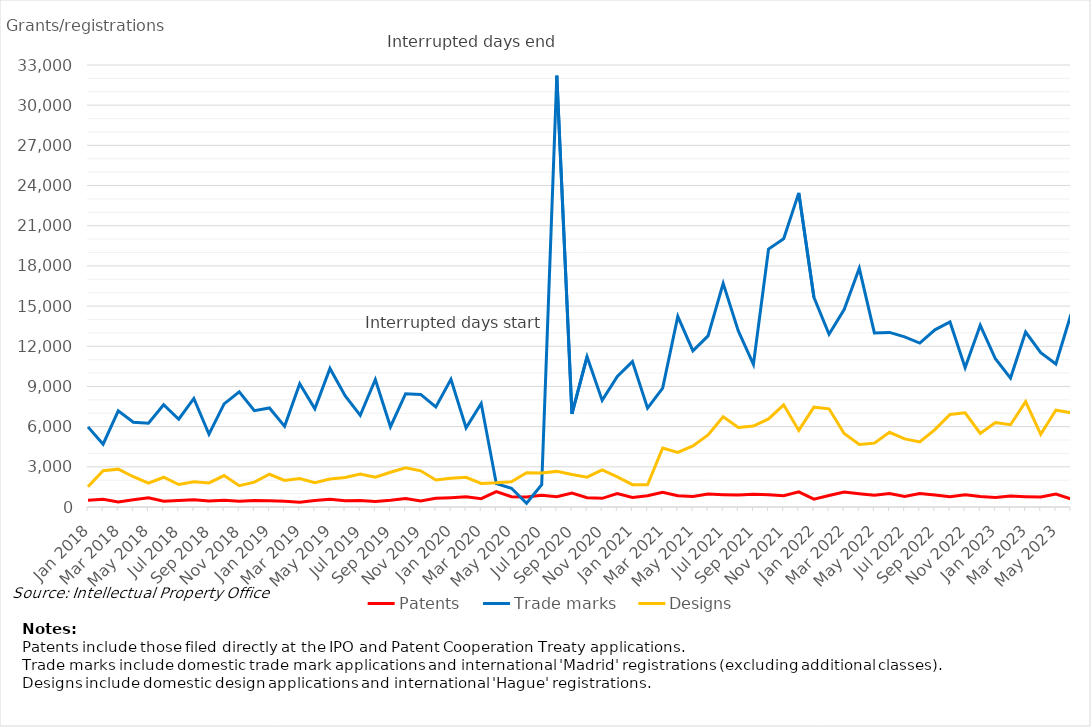
| Category | Patents | Trade marks | Designs |
|---|---|---|---|
| Jan 2018 | 495 | 5980 | 1512 |
| Feb 2018 | 574 | 4687 | 2704 |
| Mar 2018 | 370 | 7179 | 2825 |
| Apr 2018 | 543 | 6334 | 2259 |
| May 2018 | 690 | 6253 | 1789 |
| Jun 2018 | 424 | 7637 | 2222 |
| Jul 2018 | 486 | 6552 | 1678 |
| Aug 2018 | 536 | 8104 | 1878 |
| Sep 2018 | 450 | 5431 | 1795 |
| Oct 2018 | 498 | 7701 | 2348 |
| Nov 2018 | 432 | 8603 | 1592 |
| Dec 2018 | 484 | 7194 | 1859 |
| Jan 2019 | 474 | 7396 | 2444 |
| Feb 2019 | 426 | 6023 | 1987 |
| Mar 2019 | 363 | 9208 | 2125 |
| Apr 2019 | 488 | 7339 | 1810 |
| May 2019 | 573 | 10347 | 2096 |
| Jun 2019 | 471 | 8305 | 2202 |
| Jul 2019 | 489 | 6840 | 2464 |
| Aug 2019 | 420 | 9519 | 2218 |
| Sep 2019 | 500 | 5992 | 2596 |
| Oct 2019 | 634 | 8460 | 2926 |
| Nov 2019 | 455 | 8404 | 2700 |
| Dec 2019 | 654 | 7467 | 2021 |
| Jan 2020 | 696 | 9527 | 2145 |
| Feb 2020 | 756 | 5908 | 2219 |
| Mar 2020 | 622 | 7723 | 1757 |
| Apr 2020 | 1143 | 1743 | 1803 |
| May 2020 | 768 | 1399 | 1888 |
| Jun 2020 | 740 | 282 | 2564 |
| Jul 2020 | 878 | 1660 | 2539 |
| Aug 2020 | 771 | 32206 | 2659 |
| Sep 2020 | 1042 | 6950 | 2425 |
| Oct 2020 | 697 | 11226 | 2223 |
| Nov 2020 | 649 | 7958 | 2763 |
| Dec 2020 | 1010 | 9753 | 2252 |
| Jan 2021 | 708 | 10856 | 1665 |
| Feb 2021 | 838 | 7381 | 1660 |
| Mar 2021 | 1107 | 8878 | 4408 |
| Apr 2021 | 838 | 14235 | 4074 |
| May 2021 | 788 | 11654 | 4562 |
| Jun 2021 | 972 | 12773 | 5385 |
| Jul 2021 | 918 | 16698 | 6731 |
| Aug 2021 | 887 | 13150 | 5944 |
| Sep 2021 | 947 | 10649 | 6041 |
| Oct 2021 | 920 | 19255 | 6577 |
| Nov 2021 | 841 | 20030 | 7629 |
| Dec 2021 | 1131 | 23452 | 5719 |
| Jan 2022 | 585 | 15661 | 7455 |
| Feb 2022 | 860 | 12899 | 7329 |
| Mar 2022 | 1111 | 14745 | 5482 |
| Apr 2022 | 990 | 17821 | 4662 |
| May 2022 | 883 | 12995 | 4767 |
| Jun 2022 | 1010 | 13035 | 5577 |
| Jul 2022 | 788 | 12701 | 5082 |
| Aug 2022 | 1007 | 12237 | 4856 |
| Sep 2022 | 889 | 13229 | 5776 |
| Oct 2022 | 758 | 13818 | 6904 |
| Nov 2022 | 920 | 10407 | 7027 |
| Dec 2022 | 777 | 13566 | 5498 |
| Jan 2023 | 708 | 11068 | 6304 |
| Feb 2023 | 817 | 9626 | 6141 |
| Mar 2023 | 770 | 13064 | 7872 |
| Apr 2023 | 747 | 11525 | 5420 |
| May 2023 | 963 | 10680 | 7237 |
| Jun 2023 | 606 | 14387 | 7033 |